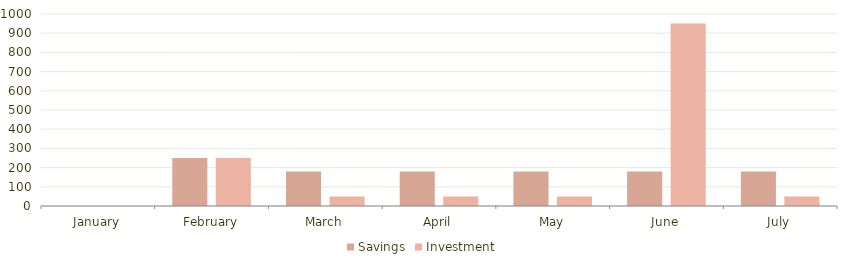
| Category | Savings | Investment |
|---|---|---|
| January | 0 | 0 |
| February | 250 | 250 |
| March | 180 | 50 |
| April | 180 | 50 |
| May | 180 | 50 |
| June | 180 | 950 |
| July | 180 | 50 |